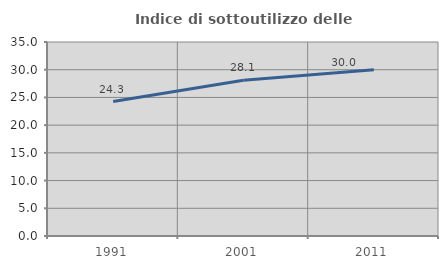
| Category | Indice di sottoutilizzo delle abitazioni  |
|---|---|
| 1991.0 | 24.251 |
| 2001.0 | 28.112 |
| 2011.0 | 30.006 |